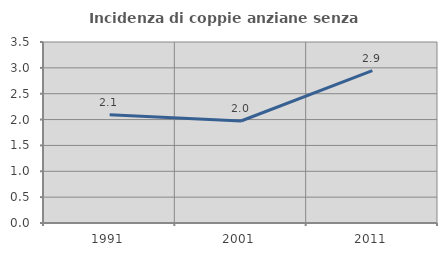
| Category | Incidenza di coppie anziane senza figli  |
|---|---|
| 1991.0 | 2.093 |
| 2001.0 | 1.973 |
| 2011.0 | 2.947 |